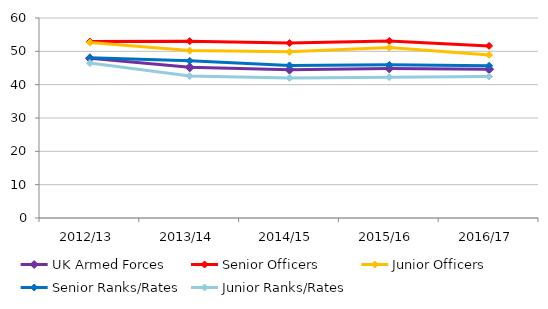
| Category | UK Armed Forces | Senior Officers | Junior Officers | Senior Ranks/Rates | Junior Ranks/Rates |
|---|---|---|---|---|---|
| 2012/13 | 47.899 | 52.919 | 52.633 | 48.049 | 46.475 |
| 2013/14 | 45.2 | 53.045 | 50.221 | 47.145 | 42.585 |
| 2014/15 | 44.503 | 52.47 | 49.84 | 45.774 | 42.036 |
| 2015/16 | 44.875 | 53.121 | 51.12 | 45.938 | 42.234 |
| 2016/17 | 44.652 | 51.634 | 48.921 | 45.665 | 42.442 |